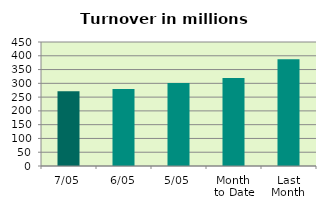
| Category | Series 0 |
|---|---|
| 7/05 | 270.906 |
| 6/05 | 279.269 |
| 5/05 | 301.411 |
| Month 
to Date | 319.714 |
| Last
Month | 387.046 |